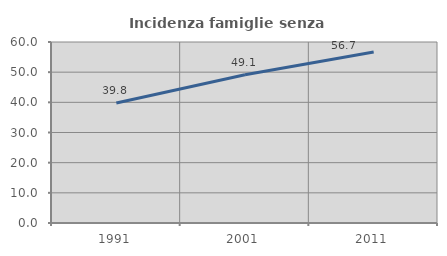
| Category | Incidenza famiglie senza nuclei |
|---|---|
| 1991.0 | 39.797 |
| 2001.0 | 49.114 |
| 2011.0 | 56.667 |